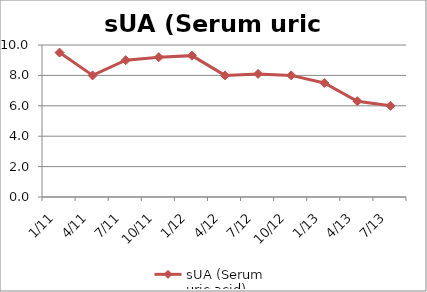
| Category | sUA (Serum uric acid) |
|---|---|
| 1/11 | 9.5 |
| 4/11 | 8 |
| 7/11 | 9 |
| 10/11 | 9.2 |
| 1/12 | 9.3 |
| 4/12 | 8 |
| 7/12 | 8.1 |
| 10/12 | 8 |
| 1/13 | 7.5 |
| 4/13 | 6.3 |
| 7/13 | 6 |